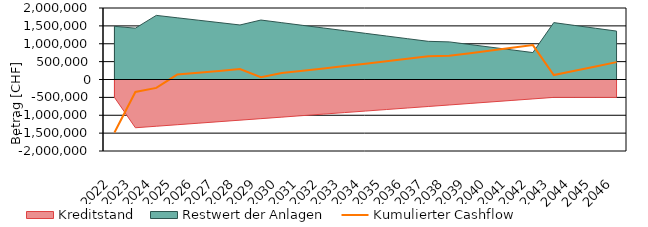
| Category | Kumulierter Cashflow |
|---|---|
| 2022.0 | -1481800 |
| 2023.0 | -348329.038 |
| 2024.0 | -235540.97 |
| 2025.0 | 137844.017 |
| 2026.0 | 188432.453 |
| 2027.0 | 240229.865 |
| 2028.0 | 293239.43 |
| 2029.0 | 63067.702 |
| 2030.0 | 183301.068 |
| 2031.0 | 246471.055 |
| 2032.0 | 310859.953 |
| 2033.0 | 376471.116 |
| 2034.0 | 443307.897 |
| 2035.0 | 511373.655 |
| 2036.0 | 580671.747 |
| 2037.0 | 651205.532 |
| 2038.0 | 663705.821 |
| 2039.0 | 736721.077 |
| 2040.0 | 810982.114 |
| 2041.0 | 886492.298 |
| 2042.0 | 963254.996 |
| 2043.0 | 124210.25 |
| 2044.0 | 244713.089 |
| 2045.0 | 365203.559 |
| 2046.0 | 485685.035 |